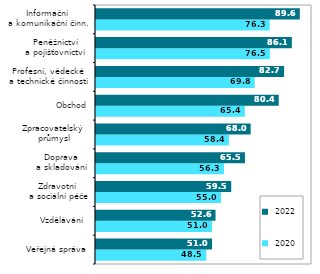
| Category |  2020 |  2022 |
|---|---|---|
| Veřejná správa | 48.516 | 51.04 |
| Vzdělávání  | 50.999 | 52.567 |
| Zdravotní 
a sociální péče | 54.968 | 59.473 |
| Doprava 
a skladování  | 56.268 | 65.51 |
| Zpracovatelský 
průmysl | 58.447 | 68.028 |
| Obchod | 65.435 | 80.375 |
| Profesní, vědecké 
a technické činnosti | 69.778 | 82.735 |
| Peněžnictví 
a pojišťovnictví  | 76.476 | 86.134 |
| Informační 
a komunikační činn. | 76.344 | 89.641 |